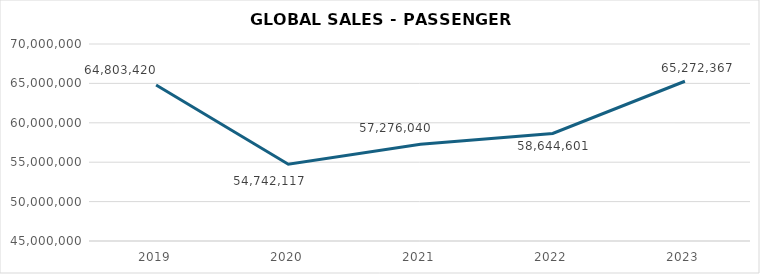
| Category | Series 0 |
|---|---|
| 2019.0 | 64803420 |
| 2020.0 | 54742117 |
| 2021.0 | 57276040 |
| 2022.0 | 58644601 |
| 2023.0 | 65272367 |